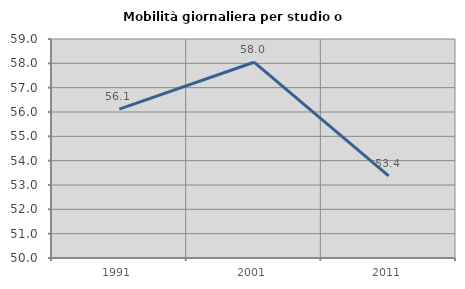
| Category | Mobilità giornaliera per studio o lavoro |
|---|---|
| 1991.0 | 56.118 |
| 2001.0 | 58.046 |
| 2011.0 | 53.375 |